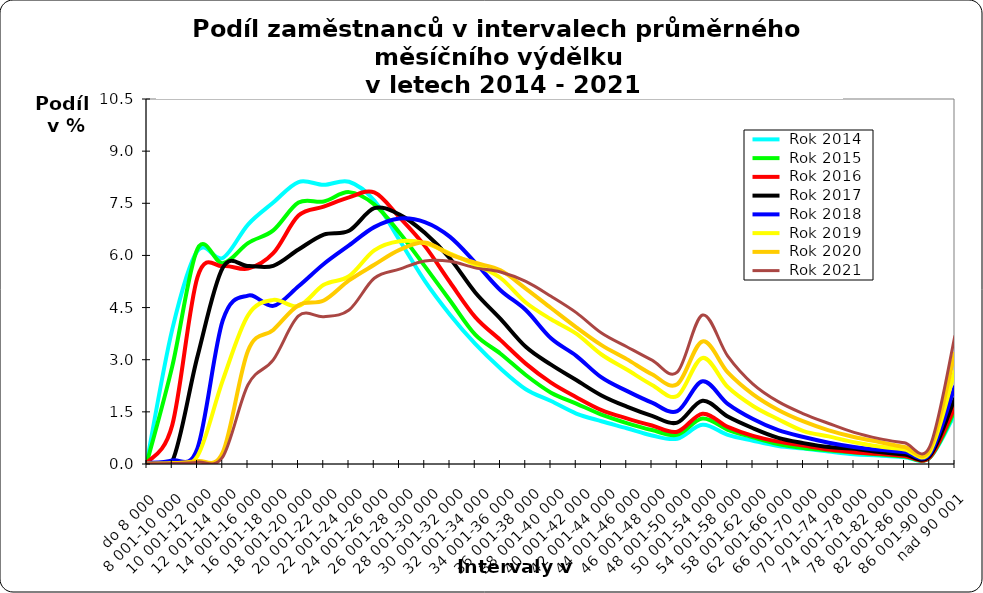
| Category |  Rok 2014 |  Rok 2015 |  Rok 2016 |  Rok 2017 |  Rok 2018 |  Rok 2019 |  Rok 2020 |  Rok 2021 |
|---|---|---|---|---|---|---|---|---|
| do 8 000 | 0.084 | 0.052 | 0.038 | 0.014 | 0.027 | 0.005 | 0.013 | 0.005 |
| 8 001-10 000 | 3.873 | 2.808 | 1.119 | 0.071 | 0.101 | 0.016 | 0.026 | 0.013 |
| 10 001-12 000 | 6.134 | 6.187 | 5.377 | 3.096 | 0.457 | 0.232 | 0.085 | 0.053 |
| 12 001-14 000 | 5.928 | 5.775 | 5.692 | 5.647 | 4.129 | 2.407 | 0.335 | 0.203 |
| 14 001-16 000 | 6.888 | 6.356 | 5.62 | 5.694 | 4.846 | 4.277 | 3.261 | 2.278 |
| 16 001-18 000 | 7.521 | 6.72 | 6.063 | 5.702 | 4.548 | 4.721 | 3.858 | 2.997 |
| 18 001-20 000 | 8.112 | 7.52 | 7.146 | 6.17 | 5.113 | 4.544 | 4.568 | 4.26 |
| 20 001-22 000 | 8.03 | 7.553 | 7.401 | 6.602 | 5.754 | 5.154 | 4.702 | 4.239 |
| 22 001-24 000 | 8.12 | 7.821 | 7.668 | 6.708 | 6.288 | 5.402 | 5.28 | 4.43 |
| 24 001-26 000 | 7.581 | 7.468 | 7.813 | 7.36 | 6.814 | 6.143 | 5.731 | 5.342 |
| 26 001-28 000 | 6.437 | 6.654 | 7.095 | 7.175 | 7.064 | 6.405 | 6.159 | 5.605 |
| 28 001-30 000 | 5.269 | 5.692 | 6.275 | 6.65 | 6.961 | 6.354 | 6.369 | 5.842 |
| 30 001-32 000 | 4.296 | 4.704 | 5.229 | 5.912 | 6.535 | 6.054 | 6.031 | 5.832 |
| 32 001-34 000 | 3.453 | 3.72 | 4.227 | 4.934 | 5.794 | 5.729 | 5.789 | 5.642 |
| 34 001-36 000 | 2.747 | 3.173 | 3.563 | 4.175 | 4.999 | 5.35 | 5.572 | 5.522 |
| 36 001-38 000 | 2.152 | 2.561 | 2.888 | 3.371 | 4.429 | 4.646 | 5.047 | 5.252 |
| 38 001-40 000 | 1.811 | 2.053 | 2.34 | 2.858 | 3.617 | 4.164 | 4.488 | 4.825 |
| 40 001-42 000 | 1.452 | 1.739 | 1.923 | 2.415 | 3.112 | 3.75 | 3.932 | 4.355 |
| 42 001-44 000 | 1.231 | 1.421 | 1.55 | 1.973 | 2.489 | 3.15 | 3.42 | 3.768 |
| 44 001-46 000 | 1.028 | 1.178 | 1.313 | 1.651 | 2.103 | 2.716 | 3.017 | 3.374 |
| 46 001-48 000 | 0.82 | 0.977 | 1.108 | 1.386 | 1.764 | 2.274 | 2.581 | 2.987 |
| 48 001-50 000 | 0.728 | 0.839 | 0.928 | 1.191 | 1.52 | 1.954 | 2.296 | 2.64 |
| 50 001-54 000 | 1.128 | 1.307 | 1.448 | 1.819 | 2.379 | 3.051 | 3.525 | 4.285 |
| 54 001-58 000 | 0.839 | 0.985 | 1.067 | 1.365 | 1.73 | 2.214 | 2.636 | 3.105 |
| 58 001-62 000 | 0.669 | 0.767 | 0.807 | 1.029 | 1.292 | 1.67 | 2.003 | 2.299 |
| 62 001-66 000 | 0.52 | 0.572 | 0.643 | 0.752 | 0.972 | 1.286 | 1.553 | 1.793 |
| 66 001-70 000 | 0.443 | 0.458 | 0.53 | 0.6 | 0.776 | 0.948 | 1.223 | 1.444 |
| 70 001-74 000 | 0.357 | 0.391 | 0.416 | 0.486 | 0.614 | 0.794 | 0.967 | 1.166 |
| 74 001-78 000 | 0.281 | 0.328 | 0.341 | 0.441 | 0.491 | 0.625 | 0.777 | 0.909 |
| 78 001-82 000 | 0.245 | 0.276 | 0.293 | 0.343 | 0.406 | 0.504 | 0.632 | 0.73 |
| 82 001-86 000 | 0.196 | 0.215 | 0.234 | 0.276 | 0.347 | 0.42 | 0.49 | 0.608 |
| 86 001-90 000 | 0.179 | 0.188 | 0.196 | 0.234 | 0.285 | 0.341 | 0.417 | 0.5 |
| nad 90 001 | 1.45 | 1.544 | 1.652 | 1.899 | 2.243 | 2.699 | 3.217 | 3.698 |